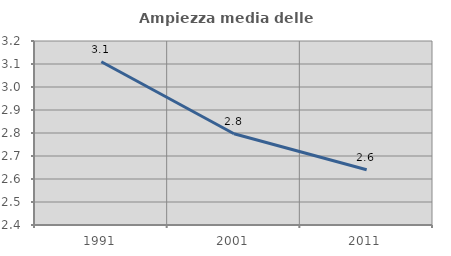
| Category | Ampiezza media delle famiglie |
|---|---|
| 1991.0 | 3.11 |
| 2001.0 | 2.797 |
| 2011.0 | 2.64 |